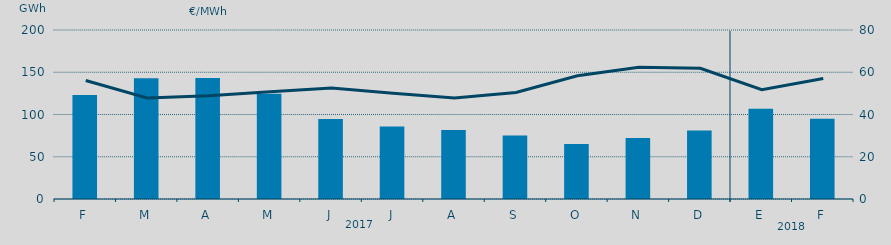
| Category | Energía a subir |
|---|---|
| F | 123063.594 |
| M | 142874.975 |
| A | 143332.881 |
| M | 124663.514 |
| J | 94559.541 |
| J | 85673.202 |
| A | 81536.076 |
| S | 75102.289 |
| O | 65089.595 |
| N | 72290.07 |
| D | 81049.796 |
| E | 106846.751 |
| F | 95118.279 |